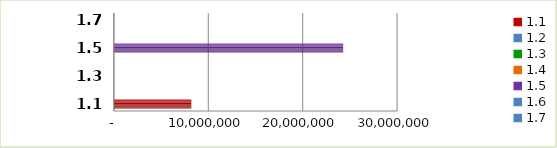
| Category | Series 0 |
|---|---|
| 1.1 | 8200360 |
| 1.2 | 0 |
| 1.3 | 0 |
| 1.4 | 0 |
| 1.5 | 24286508.2 |
| 1.6 | 0 |
| 1.7 | 0 |